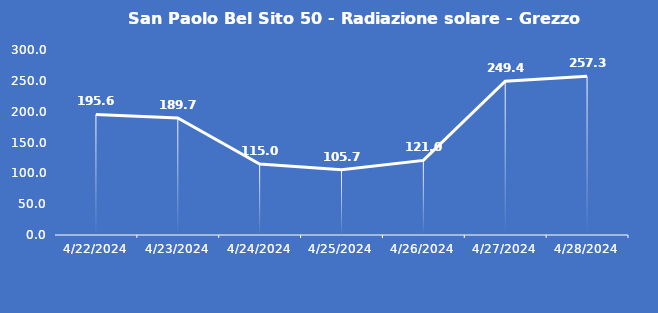
| Category | San Paolo Bel Sito 50 - Radiazione solare - Grezzo (W/m2) |
|---|---|
| 4/22/24 | 195.6 |
| 4/23/24 | 189.7 |
| 4/24/24 | 115 |
| 4/25/24 | 105.7 |
| 4/26/24 | 121 |
| 4/27/24 | 249.4 |
| 4/28/24 | 257.3 |